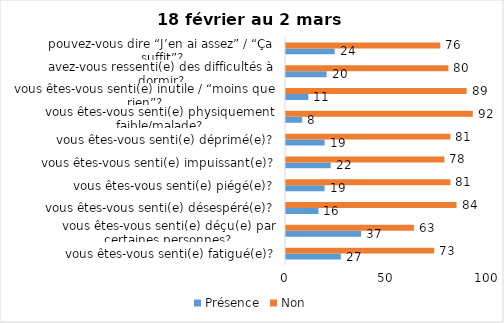
| Category | Présence | Non |
|---|---|---|
| vous êtes-vous senti(e) fatigué(e)? | 27 | 73 |
| vous êtes-vous senti(e) déçu(e) par certaines personnes? | 37 | 63 |
| vous êtes-vous senti(e) désespéré(e)? | 16 | 84 |
| vous êtes-vous senti(e) piégé(e)? | 19 | 81 |
| vous êtes-vous senti(e) impuissant(e)? | 22 | 78 |
| vous êtes-vous senti(e) déprimé(e)? | 19 | 81 |
| vous êtes-vous senti(e) physiquement faible/malade? | 8 | 92 |
| vous êtes-vous senti(e) inutile / “moins que rien”? | 11 | 89 |
| avez-vous ressenti(e) des difficultés à dormir? | 20 | 80 |
| pouvez-vous dire “J’en ai assez” / “Ça suffit”? | 24 | 76 |